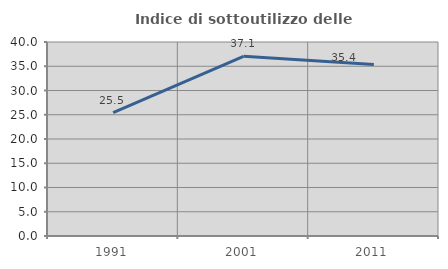
| Category | Indice di sottoutilizzo delle abitazioni  |
|---|---|
| 1991.0 | 25.455 |
| 2001.0 | 37.061 |
| 2011.0 | 35.381 |